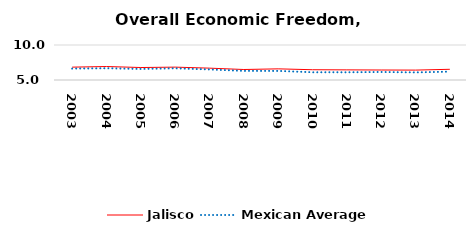
| Category | Jalisco | Mexican Average  |
|---|---|---|
| 2003.0 | 6.837 | 6.632 |
| 2004.0 | 6.924 | 6.678 |
| 2005.0 | 6.783 | 6.582 |
| 2006.0 | 6.838 | 6.668 |
| 2007.0 | 6.693 | 6.508 |
| 2008.0 | 6.499 | 6.3 |
| 2009.0 | 6.592 | 6.3 |
| 2010.0 | 6.468 | 6.105 |
| 2011.0 | 6.447 | 6.103 |
| 2012.0 | 6.428 | 6.144 |
| 2013.0 | 6.413 | 6.087 |
| 2014.0 | 6.531 | 6.195 |